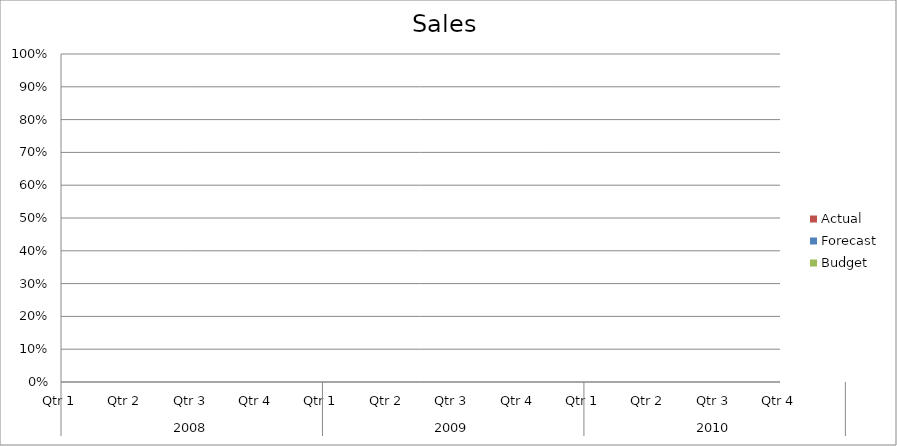
| Category | Budget | Forecast | Actual |
|---|---|---|---|
| 0 | 1020 | 1710 | 1400 |
| 1 | 3280 | 3060 | 3010 |
| 2 | 1570 | 2340 | 1400 |
| 3 | 3210 | 890 | 680 |
| 4 | 2260 | 2360 | 1150 |
| 5 | 3470 | 870 | 2770 |
| 6 | 3440 | 2970 | 1040 |
| 7 | 1200 | 3480 | 3270 |
| 8 | 580 | 1860 | 3330 |
| 9 | 3190 | 2060 | 3010 |
| 10 | 520 | 1190 | 2580 |
| 11 | 880 | 3330 | 2710 |